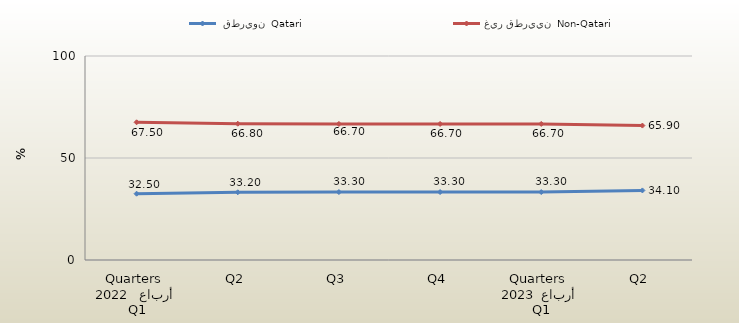
| Category |  قطريون  Qatari | غير قطريين  Non-Qatari |
|---|---|---|
| 0 | 32.5 | 67.5 |
| 1 | 33.2 | 66.8 |
| 2 | 33.3 | 66.7 |
| 3 | 33.3 | 66.7 |
| 4 | 33.3 | 66.7 |
| 5 | 34.1 | 65.9 |